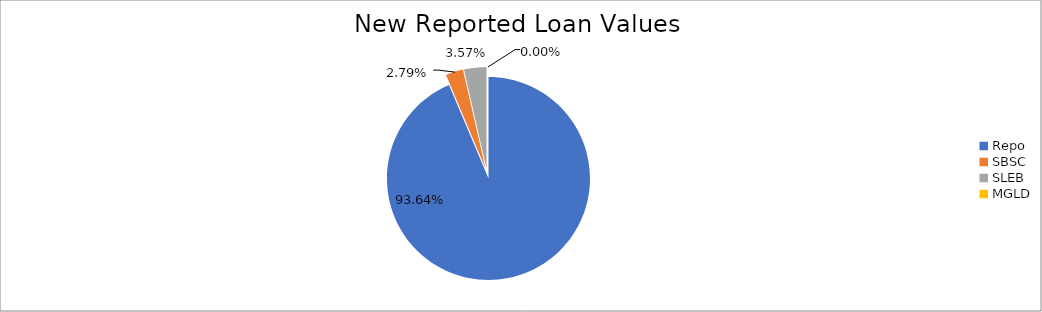
| Category | Series 0 |
|---|---|
| Repo | 9620148.64 |
| SBSC | 286621.37 |
| SLEB | 366874.724 |
| MGLD | 32.97 |